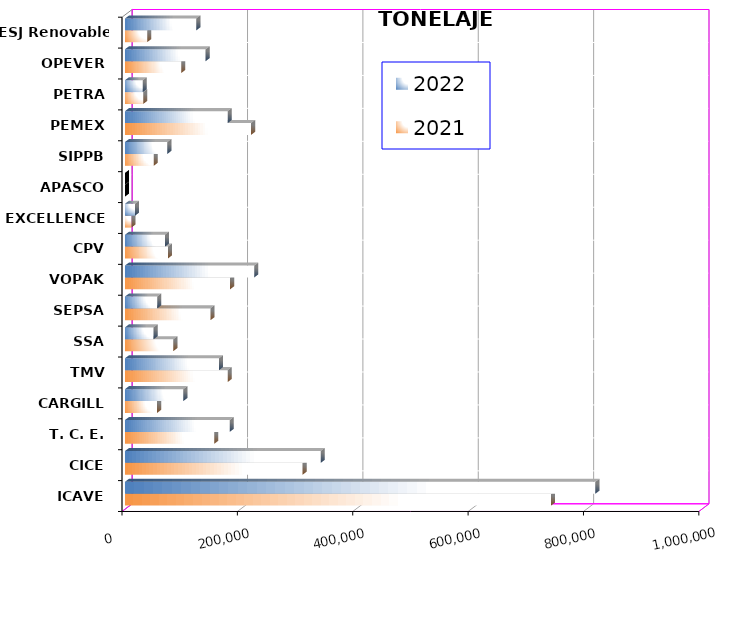
| Category | 2021 | 2022 |
|---|---|---|
| ICAVE | 738603.672 | 815466.09 |
| CICE | 307956.64 | 339485.49 |
| T. C. E. | 154808.341 | 181514.29 |
| CARGILL | 55644.65 | 101253.11 |
| TMV | 178051.76 | 162996.85 |
| SSA | 83846.662 | 49596.608 |
| SEPSA | 148110.8 | 55955.6 |
| VOPAK | 182197.562 | 224109.466 |
| CPV | 74479.14 | 69409.34 |
| EXCELLENCE | 11237.89 | 17444.88 |
| APASCO | 0 | 0 |
| SIPPB | 49936.375 | 73483.851 |
| PEMEX | 218598.927 | 178174.525 |
| PETRA | 31599.83 | 30915.86 |
| OPEVER | 97392.32 | 139763.65 |
| ESJ Renovable III | 38470.476 | 123765.215 |